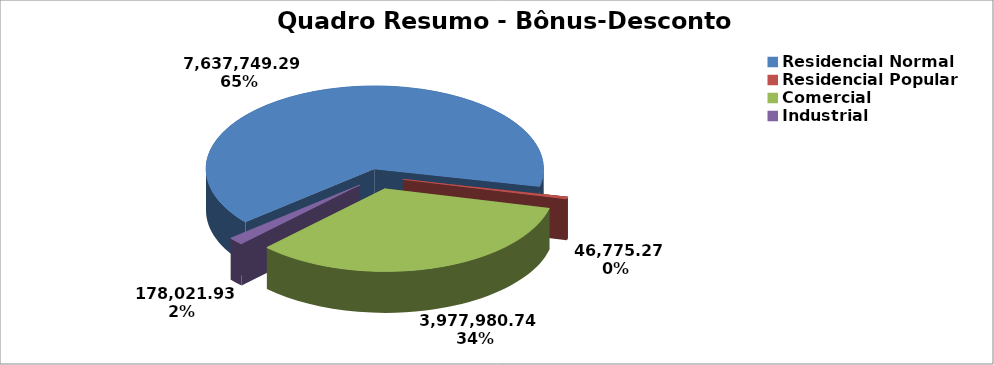
| Category | Quadro Resumo - Bônus-Desconto |
|---|---|
| Residencial Normal | 7637749.288 |
| Residencial Popular | 46775.272 |
| Comercial | 3977980.744 |
| Industrial | 178021.932 |